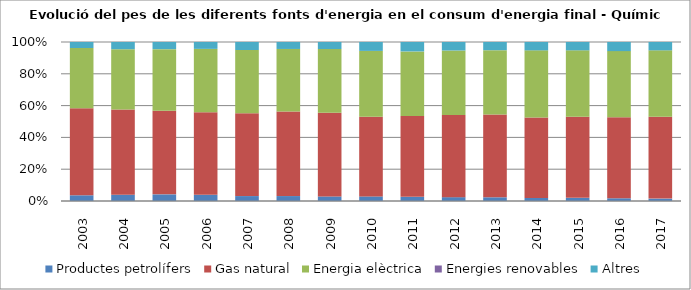
| Category | Productes petrolífers | Gas natural | Energia elèctrica | Energies renovables | Altres |
|---|---|---|---|---|---|
| 2003.0 | 43 | 655.6 | 453.5 | 0 | 45.4 |
| 2004.0 | 46.6 | 635 | 448.2 | 0 | 53.6 |
| 2005.0 | 49.5 | 622.9 | 460.5 | 0 | 53.2 |
| 2006.0 | 44.9 | 597.8 | 457.4 | 0 | 49.8 |
| 2007.0 | 36.4 | 612.1 | 467.1 | 0 | 59.2 |
| 2008.0 | 34.1 | 583.7 | 432.1 | 0 | 48.1 |
| 2009.0 | 28.4 | 520.3 | 396.7 | 0 | 43.8 |
| 2010.0 | 29.4 | 511.5 | 422.3 | 0 | 57.2 |
| 2011.0 | 27.4 | 532.6 | 425.4 | 0.1 | 62.1 |
| 2012.0 | 24.9 | 532.5 | 418.6 | 0 | 55.1 |
| 2013.0 | 22.4 | 500.9 | 390 | 0 | 49.6 |
| 2014.0 | 18.3 | 493.4 | 412 | 0 | 51.3 |
| 2015.0 | 20 | 516.3 | 422.3 | 0 | 53 |
| 2016.0 | 17.4 | 518.5 | 421.9 | 0 | 58.3 |
| 2017.0 | 15.4 | 530.3 | 431 | 0 | 54.1 |